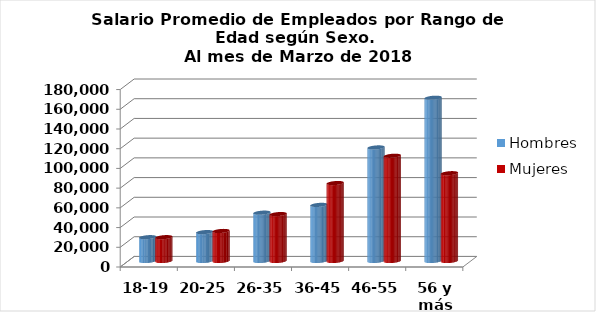
| Category | Hombres | Mujeres |
|---|---|---|
| 18-19 | 24156 | 24156 |
| 20-25 | 29302.2 | 30446.667 |
| 26-35 | 49020.389 | 47580.288 |
| 36-45 | 56910.215 | 79068.029 |
| 46-55 | 115203.592 | 106732.711 |
| 56 y más | 165597.287 | 89047.35 |